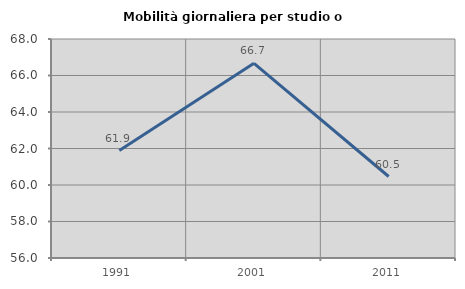
| Category | Mobilità giornaliera per studio o lavoro |
|---|---|
| 1991.0 | 61.885 |
| 2001.0 | 66.667 |
| 2011.0 | 60.465 |